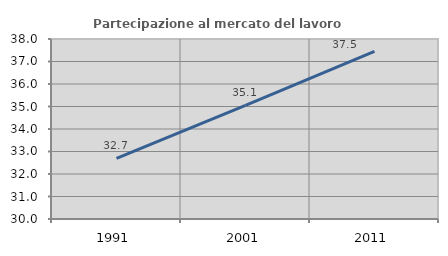
| Category | Partecipazione al mercato del lavoro  femminile |
|---|---|
| 1991.0 | 32.692 |
| 2001.0 | 35.052 |
| 2011.0 | 37.455 |